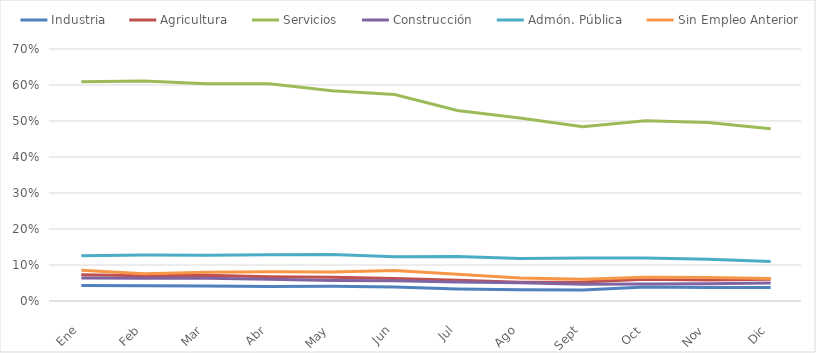
| Category | Industria | Agricultura | Servicios | Construcción | Admón. Pública | Sin Empleo Anterior |
|---|---|---|---|---|---|---|
| Ene | 0.043 | 0.073 | 0.609 | 0.064 | 0.126 | 0.086 |
| Feb | 0.042 | 0.07 | 0.611 | 0.063 | 0.128 | 0.076 |
| Mar | 0.042 | 0.071 | 0.603 | 0.063 | 0.127 | 0.08 |
| Abr | 0.04 | 0.067 | 0.603 | 0.06 | 0.128 | 0.082 |
| May | 0.041 | 0.066 | 0.584 | 0.057 | 0.129 | 0.08 |
| Jun | 0.039 | 0.062 | 0.573 | 0.056 | 0.123 | 0.084 |
| Jul | 0.033 | 0.058 | 0.529 | 0.053 | 0.123 | 0.074 |
| Ago | 0.031 | 0.052 | 0.509 | 0.051 | 0.118 | 0.064 |
| Sept | 0.031 | 0.053 | 0.484 | 0.047 | 0.119 | 0.06 |
| Oct | 0.039 | 0.06 | 0.501 | 0.047 | 0.119 | 0.066 |
| Nov | 0.037 | 0.058 | 0.496 | 0.048 | 0.116 | 0.065 |
| Dic | 0.038 | 0.06 | 0.478 | 0.05 | 0.11 | 0.062 |